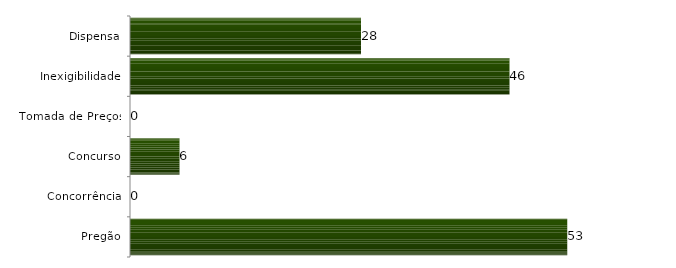
| Category | Series 0 |
|---|---|
| Pregão | 53 |
| Concorrência | 0 |
| Concurso | 6 |
| Tomada de Preços | 0 |
| Inexigibilidade | 46 |
| Dispensa | 28 |